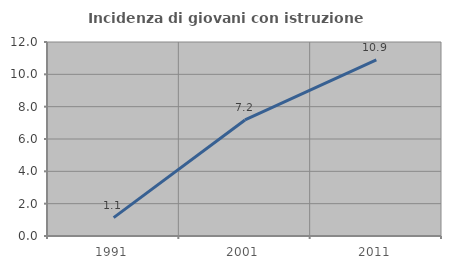
| Category | Incidenza di giovani con istruzione universitaria |
|---|---|
| 1991.0 | 1.136 |
| 2001.0 | 7.179 |
| 2011.0 | 10.9 |